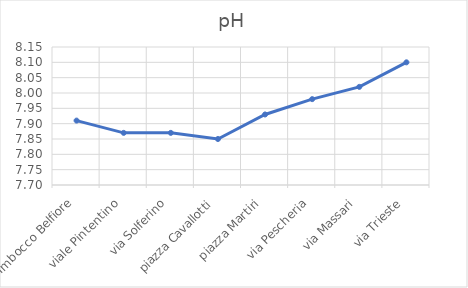
| Category |  pH |
|---|---|
| Imbocco Belfiore | 7.91 |
| viale Pintentino | 7.87 |
| via Solferino | 7.87 |
| piazza Cavallotti | 7.85 |
| piazza Martiri | 7.93 |
| via Pescheria | 7.98 |
| via Massari | 8.02 |
| via Trieste | 8.1 |